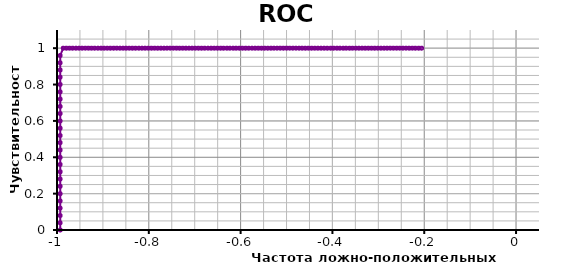
| Category | Series 0 |
|---|---|
| -0.9931506849315068 | 0 |
| -0.9931506849315068 | 0.04 |
| -0.9931506849315068 | 0.08 |
| -0.9931506849315068 | 0.12 |
| -0.9931506849315068 | 0.16 |
| -0.9931506849315068 | 0.2 |
| -0.9931506849315068 | 0.24 |
| -0.9931506849315068 | 0.28 |
| -0.9931506849315068 | 0.32 |
| -0.9931506849315068 | 0.36 |
| -0.9931506849315068 | 0.4 |
| -0.9931506849315068 | 0.44 |
| -0.9931506849315068 | 0.48 |
| -0.9931506849315068 | 0.52 |
| -0.9931506849315068 | 0.56 |
| -0.9931506849315068 | 0.6 |
| -0.9931506849315068 | 0.64 |
| -0.9931506849315068 | 0.68 |
| -0.9931506849315068 | 0.72 |
| -0.9931506849315068 | 0.76 |
| -0.9931506849315068 | 0.8 |
| -0.9931506849315068 | 0.84 |
| -0.9931506849315068 | 0.88 |
| -0.9931506849315068 | 0.92 |
| -0.9931506849315068 | 0.96 |
| -0.9863013698630136 | 1 |
| -0.9794520547945206 | 1 |
| -0.9726027397260274 | 1 |
| -0.9657534246575342 | 1 |
| -0.958904109589041 | 1 |
| -0.952054794520548 | 1 |
| -0.9452054794520548 | 1 |
| -0.9383561643835616 | 1 |
| -0.9315068493150684 | 1 |
| -0.9246575342465754 | 1 |
| -0.9178082191780822 | 1 |
| -0.910958904109589 | 1 |
| -0.9041095890410958 | 1 |
| -0.8972602739726028 | 1 |
| -0.8904109589041096 | 1 |
| -0.8835616438356164 | 1 |
| -0.8767123287671232 | 1 |
| -0.8698630136986302 | 1 |
| -0.863013698630137 | 1 |
| -0.8561643835616438 | 1 |
| -0.8493150684931506 | 1 |
| -0.8424657534246576 | 1 |
| -0.8356164383561644 | 1 |
| -0.8287671232876712 | 1 |
| -0.821917808219178 | 1 |
| -0.815068493150685 | 1 |
| -0.8082191780821918 | 1 |
| -0.8013698630136986 | 1 |
| -0.7945205479452054 | 1 |
| -0.7876712328767124 | 1 |
| -0.7808219178082192 | 1 |
| -0.773972602739726 | 1 |
| -0.7671232876712328 | 1 |
| -0.7602739726027398 | 1 |
| -0.7534246575342466 | 1 |
| -0.7465753424657534 | 1 |
| -0.7397260273972602 | 1 |
| -0.7328767123287672 | 1 |
| -0.726027397260274 | 1 |
| -0.7191780821917808 | 1 |
| -0.7123287671232876 | 1 |
| -0.7054794520547946 | 1 |
| -0.6986301369863014 | 1 |
| -0.6917808219178082 | 1 |
| -0.684931506849315 | 1 |
| -0.678082191780822 | 1 |
| -0.6712328767123288 | 1 |
| -0.6643835616438356 | 1 |
| -0.6575342465753424 | 1 |
| -0.6506849315068494 | 1 |
| -0.6438356164383562 | 1 |
| -0.636986301369863 | 1 |
| -0.6301369863013698 | 1 |
| -0.6232876712328768 | 1 |
| -0.6164383561643836 | 1 |
| -0.6095890410958904 | 1 |
| -0.6027397260273972 | 1 |
| -0.5958904109589042 | 1 |
| -0.589041095890411 | 1 |
| -0.5821917808219178 | 1 |
| -0.5753424657534246 | 1 |
| -0.5684931506849316 | 1 |
| -0.5616438356164384 | 1 |
| -0.5547945205479452 | 1 |
| -0.547945205479452 | 1 |
| -0.541095890410959 | 1 |
| -0.5342465753424658 | 1 |
| -0.5273972602739726 | 1 |
| -0.5205479452054794 | 1 |
| -0.5136986301369864 | 1 |
| -0.5068493150684932 | 1 |
| -0.5 | 1 |
| -0.4931506849315068 | 1 |
| -0.4863013698630137 | 1 |
| -0.4794520547945205 | 1 |
| -0.4726027397260274 | 1 |
| -0.4657534246575342 | 1 |
| -0.4589041095890411 | 1 |
| -0.4520547945205479 | 1 |
| -0.4452054794520548 | 1 |
| -0.4383561643835616 | 1 |
| -0.4315068493150685 | 1 |
| -0.4246575342465753 | 1 |
| -0.4178082191780822 | 1 |
| -0.410958904109589 | 1 |
| -0.4041095890410959 | 1 |
| -0.3972602739726027 | 1 |
| -0.3904109589041096 | 1 |
| -0.3835616438356164 | 1 |
| -0.3767123287671233 | 1 |
| -0.3698630136986301 | 1 |
| -0.363013698630137 | 1 |
| -0.3561643835616438 | 1 |
| -0.3493150684931507 | 1 |
| -0.3424657534246575 | 1 |
| -0.3356164383561644 | 1 |
| -0.3287671232876712 | 1 |
| -0.3219178082191781 | 1 |
| -0.3150684931506849 | 1 |
| -0.3082191780821918 | 1 |
| -0.3013698630136986 | 1 |
| -0.2945205479452055 | 1 |
| -0.2876712328767123 | 1 |
| -0.2808219178082192 | 1 |
| -0.273972602739726 | 1 |
| -0.2671232876712329 | 1 |
| -0.2602739726027397 | 1 |
| -0.2534246575342466 | 1 |
| -0.2465753424657534 | 1 |
| -0.23972602739726026 | 1 |
| -0.2328767123287671 | 1 |
| -0.22602739726027396 | 1 |
| -0.2191780821917808 | 1 |
| -0.21232876712328766 | 1 |
| -0.2054794520547945 | 1 |